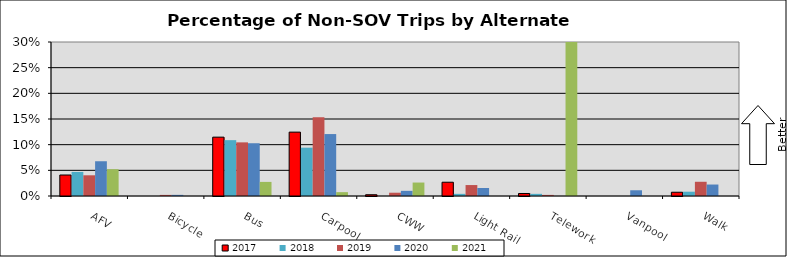
| Category | 2017 | 2018 | 2019 | 2020 | 2021 |
|---|---|---|---|---|---|
| AFV | 0.041 | 0.047 | 0.04 | 0.068 | 0.052 |
| Bicycle | 0 | 0 | 0.002 | 0.002 | 0 |
| Bus | 0.115 | 0.109 | 0.104 | 0.103 | 0.027 |
| Carpool | 0.124 | 0.094 | 0.154 | 0.121 | 0.007 |
| CWW | 0.002 | 0 | 0.006 | 0.01 | 0.026 |
| Light Rail | 0.027 | 0.004 | 0.021 | 0.016 | 0 |
| Telework | 0.005 | 0.004 | 0.002 | 0 | 0.527 |
| Vanpool | 0 | 0 | 0 | 0.011 | 0 |
| Walk | 0.007 | 0.008 | 0.028 | 0.022 | 0 |